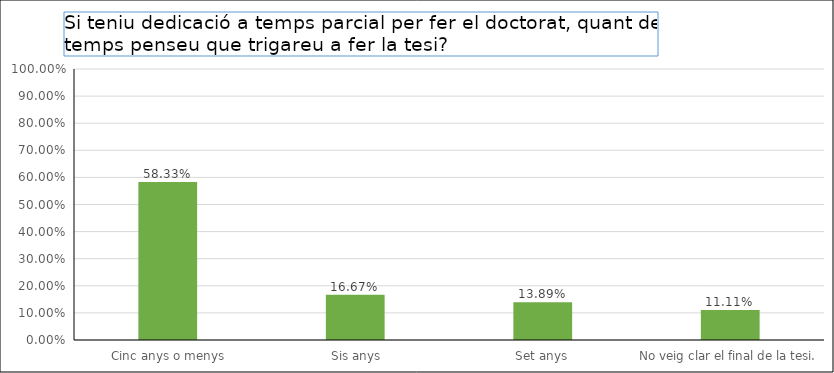
| Category | Series 0 |
|---|---|
|  Cinc anys o menys | 0.583 |
|  Sis anys | 0.167 |
| Set anys | 0.139 |
| No veig clar el final de la tesi. | 0.111 |